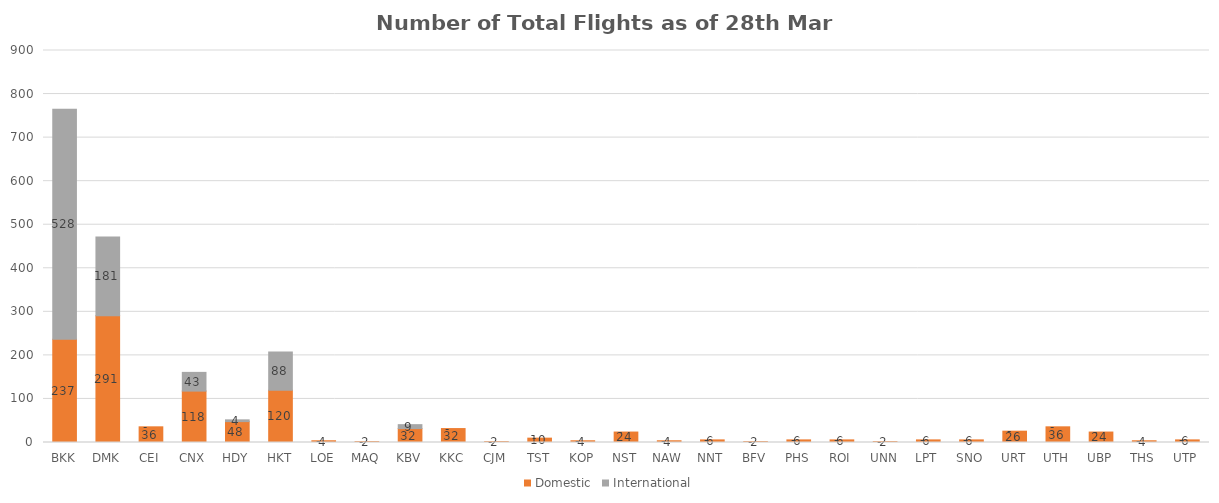
| Category | Domestic | International |
|---|---|---|
| BKK | 237 | 528 |
| DMK | 291 | 181 |
| CEI | 36 | 0 |
| CNX | 118 | 43 |
| HDY | 48 | 4 |
| HKT | 120 | 88 |
| LOE | 4 | 0 |
| MAQ | 2 | 0 |
| KBV | 32 | 9 |
| KKC | 32 | 0 |
| CJM | 2 | 0 |
| TST | 10 | 0 |
| KOP | 4 | 0 |
| NST | 24 | 0 |
| NAW | 4 | 0 |
| NNT | 6 | 0 |
| BFV | 2 | 0 |
| PHS | 6 | 0 |
| ROI | 6 | 0 |
| UNN | 2 | 0 |
| LPT | 6 | 0 |
| SNO | 6 | 0 |
| URT | 26 | 0 |
| UTH | 36 | 0 |
| UBP | 24 | 0 |
| THS | 4 | 0 |
| UTP | 6 | 0 |